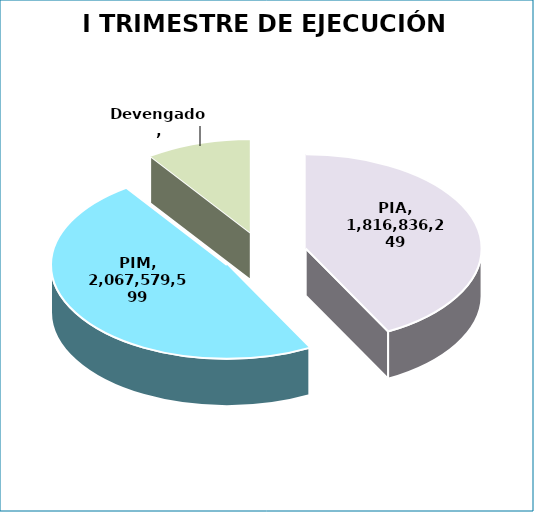
| Category | I TRIMESTRE DE EJECUCIÓN PRESUPUESTAL 2019  |
|---|---|
| PIA | 1816836249 |
| PIM | 2067579599 |
| Devengado  | 417193778 |